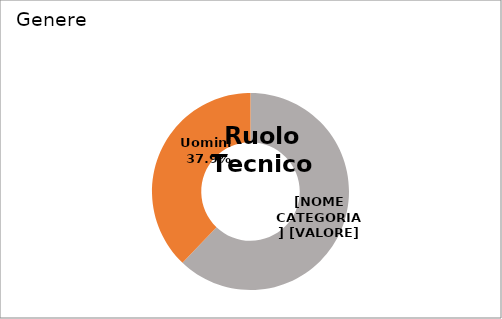
| Category | Series 0 |
|---|---|
| Donne  | 0.621 |
| Uomini  | 0.379 |